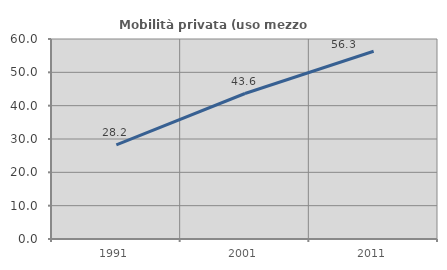
| Category | Mobilità privata (uso mezzo privato) |
|---|---|
| 1991.0 | 28.212 |
| 2001.0 | 43.649 |
| 2011.0 | 56.338 |